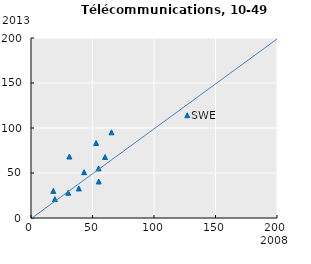
| Category | Series 0 |
|---|---|
| 65.43884276037127 | 95.205 |
| 52.911902432806734 | 83.312 |
| 55.080069493330754 | 40.549 |
| 54.95127713884235 | 55.118 |
| 19.426864270331038 | 20.967 |
| 60.209788587953064 | 67.783 |
| 18.1402279485583 | 30.1 |
| 43.15473560170864 | 50.915 |
| 38.892753890779055 | 32.841 |
| 31.22435451671096 | 68.328 |
| 30.242578997765722 | 28.085 |
| 127.0232596108971 | 114.191 |